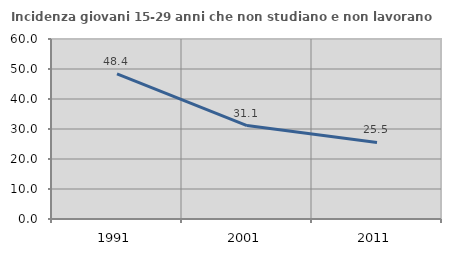
| Category | Incidenza giovani 15-29 anni che non studiano e non lavorano  |
|---|---|
| 1991.0 | 48.384 |
| 2001.0 | 31.137 |
| 2011.0 | 25.53 |